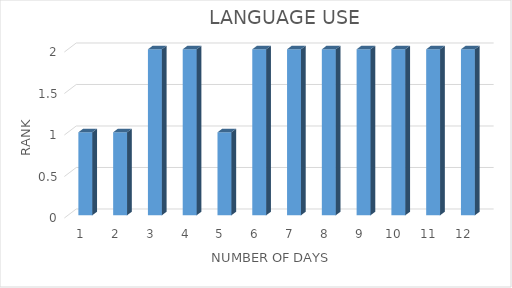
| Category | Series 0 |
|---|---|
| 0 | 1 |
| 1 | 1 |
| 2 | 2 |
| 3 | 2 |
| 4 | 1 |
| 5 | 2 |
| 6 | 2 |
| 7 | 2 |
| 8 | 2 |
| 9 | 2 |
| 10 | 2 |
| 11 | 2 |